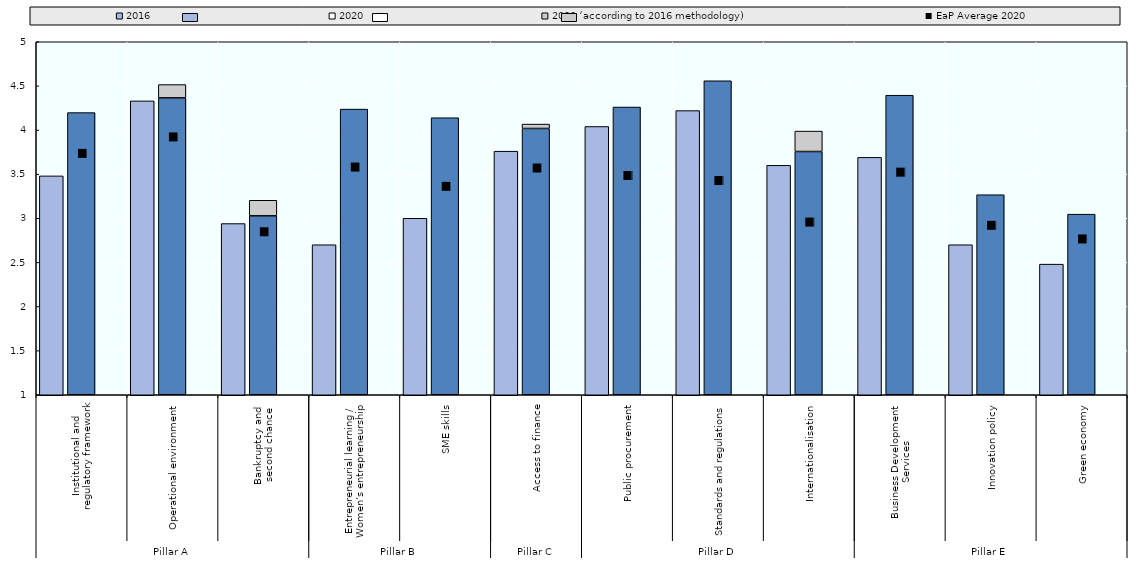
| Category | 2020 | 2020 (according to 2016 methodology) |
|---|---|---|
| 0 | 4.197 | 0 |
| 1 | 4.364 | 0.151 |
| 2 | 3.027 | 0.176 |
| 3 | 4.237 | 0 |
| 4 | 4.139 | 0 |
| 5 | 4.017 | 0.05 |
| 6 | 4.261 | 0 |
| 7 | 4.558 | 0 |
| 8 | 3.756 | 0.232 |
| 9 | 4.394 | 0 |
| 10 | 3.267 | 0 |
| 11 | 3.046 | 0 |